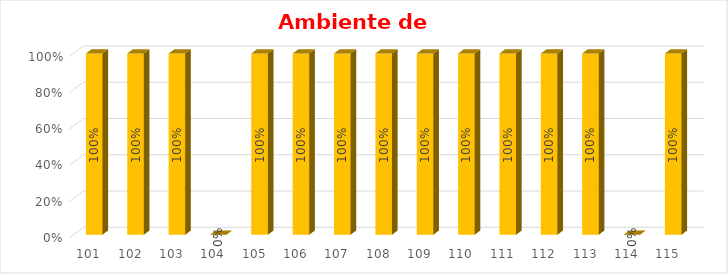
| Category | % Avance |
|---|---|
| 101.0 | 1 |
| 102.0 | 1 |
| 103.0 | 1 |
| 104.0 | 0 |
| 105.0 | 1 |
| 106.0 | 1 |
| 107.0 | 1 |
| 108.0 | 1 |
| 109.0 | 1 |
| 110.0 | 1 |
| 111.0 | 1 |
| 112.0 | 1 |
| 113.0 | 1 |
| 114.0 | 0 |
| 115.0 | 1 |